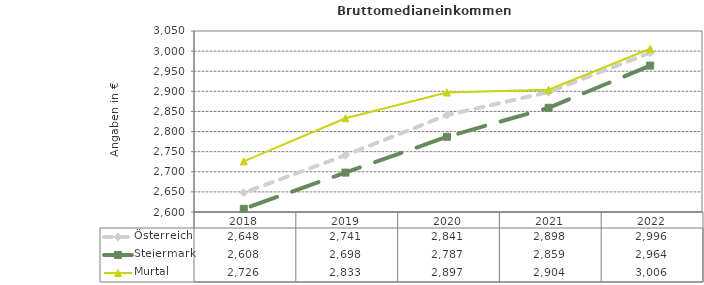
| Category | Österreich | Steiermark | Murtal |
|---|---|---|---|
| 2022.0 | 2996 | 2964 | 3006 |
| 2021.0 | 2898 | 2859 | 2904 |
| 2020.0 | 2841 | 2787 | 2897 |
| 2019.0 | 2741 | 2698 | 2833 |
| 2018.0 | 2648 | 2608 | 2726 |